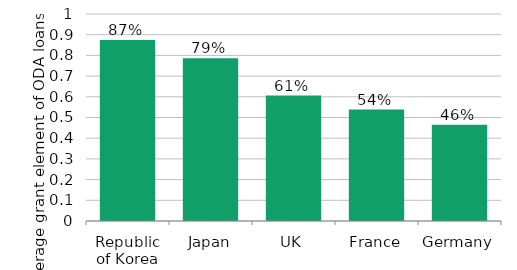
| Category | Series 0 |
|---|---|
| Republic of Korea | 0.875 |
| Japan | 0.787 |
| UK | 0.606 |
| France | 0.538 |
| Germany | 0.465 |